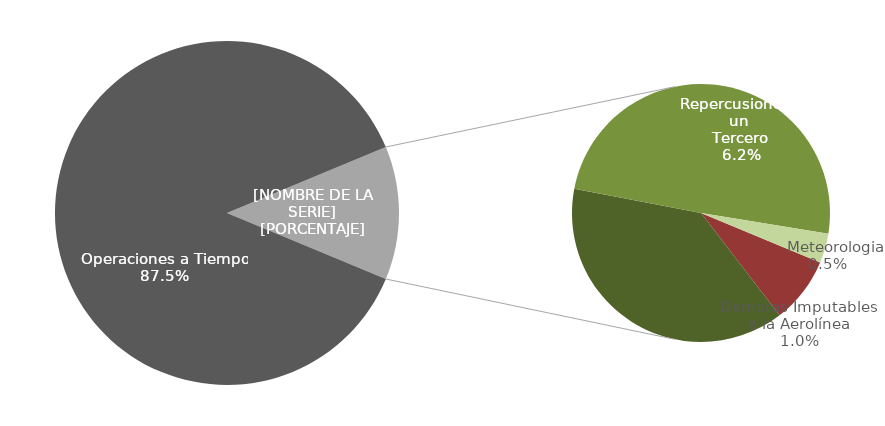
| Category | Demoras |
|---|---|
| Operaciones a Tiempo | 4702 |
| Demoras Imputables 
a la Aerolínea | 56 |
|    Aplicación de Control 
de Flujo | 259 |
|    Repercusiones por un 
Tercero | 334 |
|    Meteorologia | 25 |
|    Otras No Imputables | 0 |